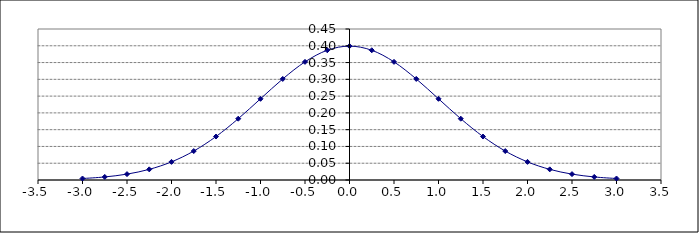
| Category | Series 0 |
|---|---|
| -3.0 | 0.004 |
| -2.75 | 0.009 |
| -2.5 | 0.018 |
| -2.25 | 0.032 |
| -2.0 | 0.054 |
| -1.75 | 0.086 |
| -1.5 | 0.13 |
| -1.25 | 0.183 |
| -1.0 | 0.242 |
| -0.75 | 0.301 |
| -0.5 | 0.352 |
| -0.25 | 0.387 |
| 0.0 | 0.399 |
| 0.25 | 0.387 |
| 0.5 | 0.352 |
| 0.75 | 0.301 |
| 1.0 | 0.242 |
| 1.25 | 0.183 |
| 1.5 | 0.13 |
| 1.75 | 0.086 |
| 2.0 | 0.054 |
| 2.25 | 0.032 |
| 2.5 | 0.018 |
| 2.75 | 0.009 |
| 3.0 | 0.004 |